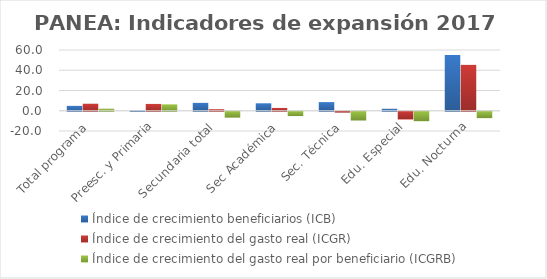
| Category | Índice de crecimiento beneficiarios (ICB)  | Índice de crecimiento del gasto real (ICGR)  | Índice de crecimiento del gasto real por beneficiario (ICGRB)  |
|---|---|---|---|
| Total programa | 4.806 | 6.906 | 2.004 |
| Preesc. y Primaria | 0.402 | 6.743 | 6.315 |
| Secundaria total | 7.775 | 1.531 | -5.794 |
| Sec Académica | 7.367 | 2.772 | -4.28 |
| Sec. Técnica | 8.533 | -0.856 | -8.651 |
| Edu. Especial | 1.935 | -7.65 | -9.403 |
| Edu. Nocturna | 55.125 | 45.296 | -6.337 |